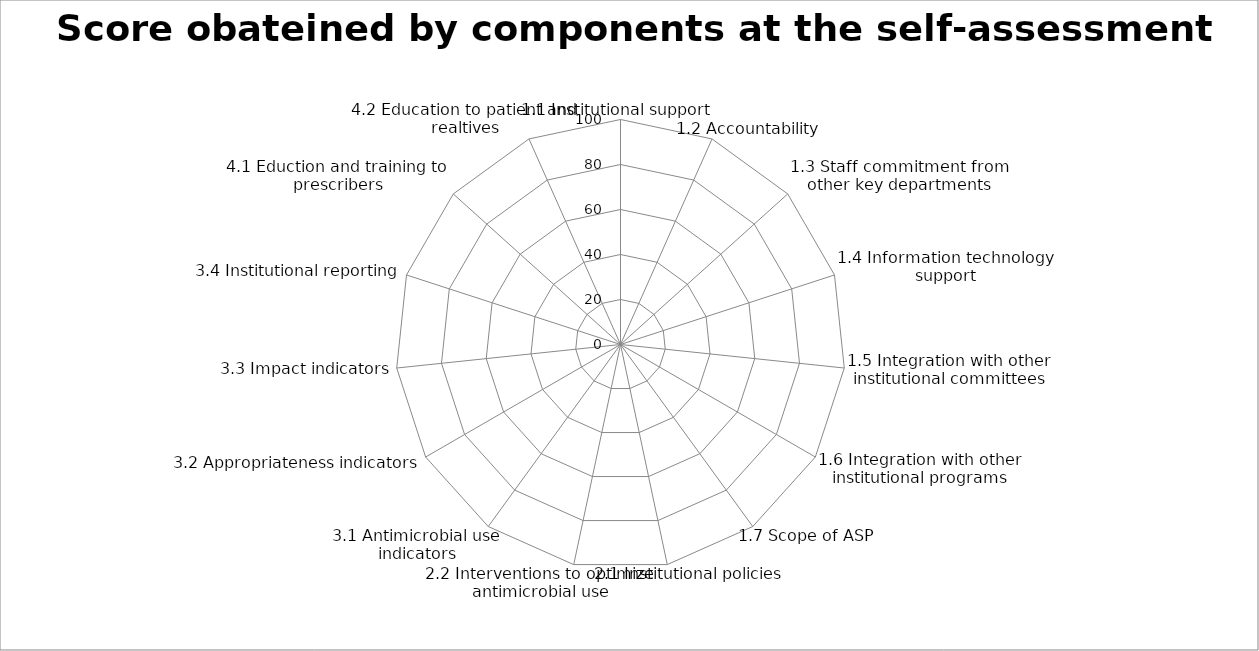
| Category | Series 0 |
|---|---|
| 1.1 Institutional support | 0 |
| 1.2 Accountability | 0 |
| 1.3 Staff commitment from other key departments | 0 |
| 1.4 Information technology support | 0 |
| 1.5 Integration with other institutional committees | 0 |
| 1.6 Integration with other institutional programs | 0 |
| 1.7 Scope of ASP | 0 |
| 2.1 Institutional policies | 0 |
| 2.2 Interventions to optimize antimicrobial use | 0 |
| 3.1 Antimicrobial use indicators | 0 |
| 3.2 Appropriateness indicators | 0 |
| 3.3 Impact indicators | 0 |
| 3.4 Institutional reporting | 0 |
| 4.1 Eduction and training to prescribers | 0 |
| 4.2 Education to patient and realtives | 0 |